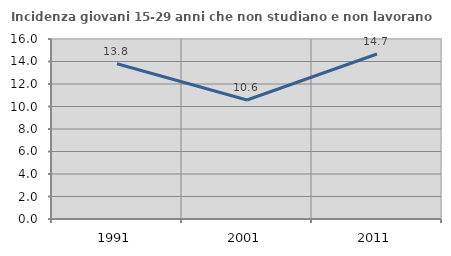
| Category | Incidenza giovani 15-29 anni che non studiano e non lavorano  |
|---|---|
| 1991.0 | 13.796 |
| 2001.0 | 10.577 |
| 2011.0 | 14.667 |